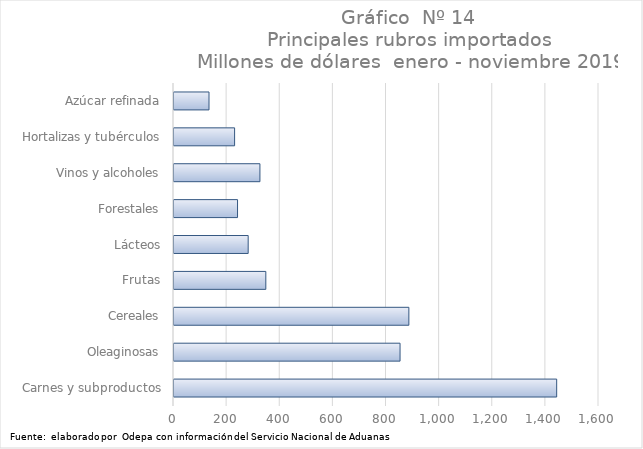
| Category | Series 0 |
|---|---|
| Carnes y subproductos | 1440682.558 |
| Oleaginosas | 851057.292 |
| Cereales | 884213.029 |
| Frutas | 345682.507 |
| Lácteos | 279282.89 |
| Forestales | 239177 |
| Vinos y alcoholes | 323499.633 |
| Hortalizas y tubérculos | 228167.124 |
| Azúcar refinada | 131782.926 |